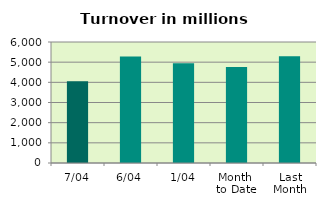
| Category | Series 0 |
|---|---|
| 7/04 | 4052.243 |
| 6/04 | 5274.925 |
| 1/04 | 4948.635 |
| Month 
to Date | 4758.601 |
| Last
Month | 5289.077 |